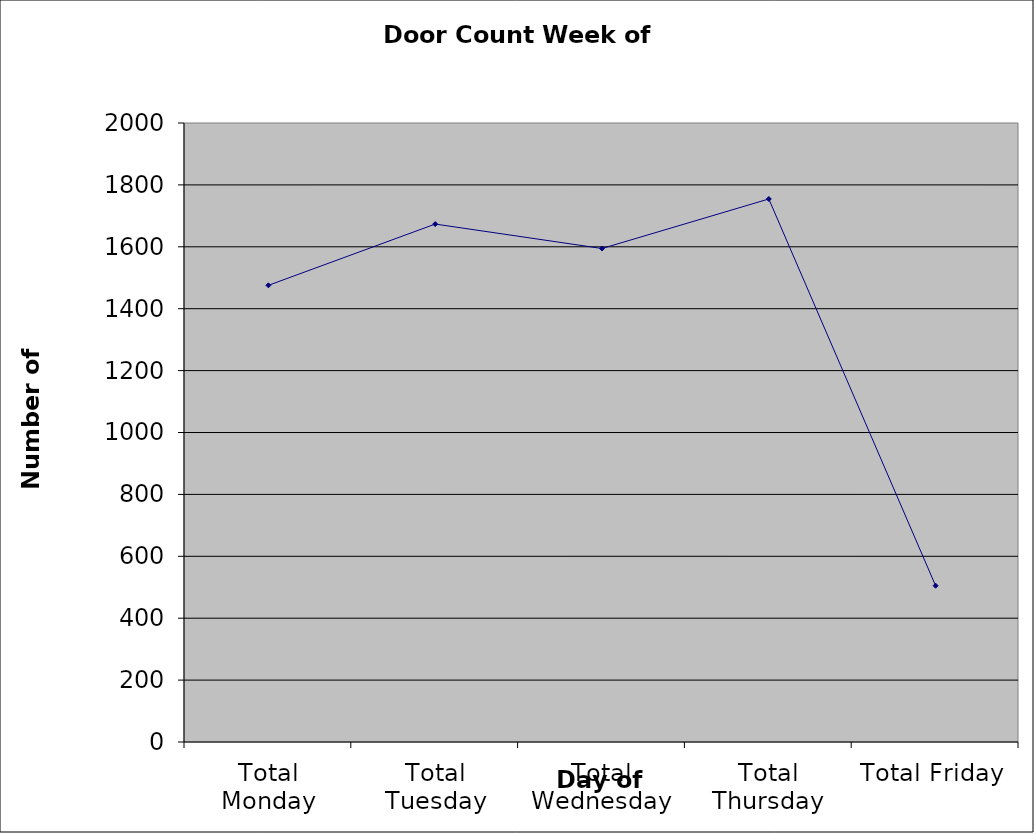
| Category | Series 0 |
|---|---|
| Total Monday | 1475.5 |
| Total Tuesday | 1673.5 |
| Total Wednesday | 1594.5 |
| Total Thursday | 1754.5 |
| Total Friday | 505 |